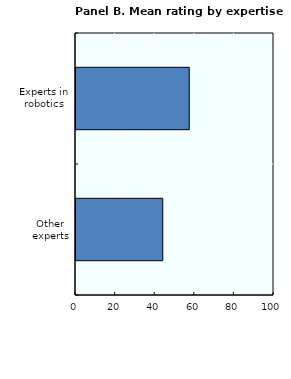
| Category | Mean score |
|---|---|
| Other experts | 43.819 |
| Experts in robotics | 57.212 |